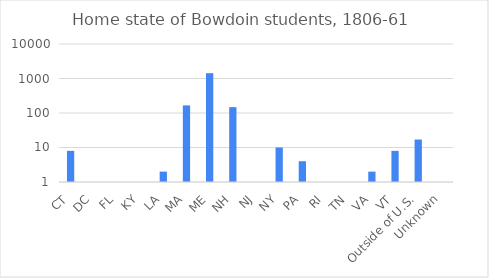
| Category | N |
|---|---|
| CT | 8 |
| DC | 1 |
| FL | 1 |
| KY | 1 |
| LA | 2 |
| MA | 166 |
| ME | 1426 |
| NH | 148 |
| NJ | 1 |
| NY | 10 |
| PA | 4 |
| RI | 1 |
| TN | 1 |
| VA | 2 |
| VT | 8 |
| Outside of U.S. | 17 |
| Unknown | 1 |